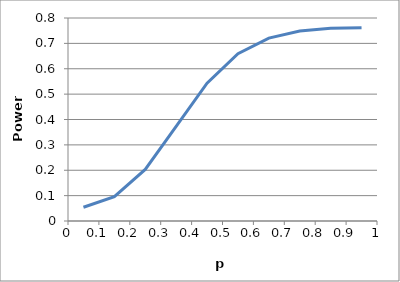
| Category | Series 0 |
|---|---|
| 0.05 | 0.054 |
| 0.15000000000000002 | 0.096 |
| 0.25 | 0.203 |
| 0.35 | 0.373 |
| 0.44999999999999996 | 0.543 |
| 0.5499999999999999 | 0.659 |
| 0.6499999999999999 | 0.721 |
| 0.7499999999999999 | 0.749 |
| 0.8499999999999999 | 0.759 |
| 0.9499999999999998 | 0.762 |